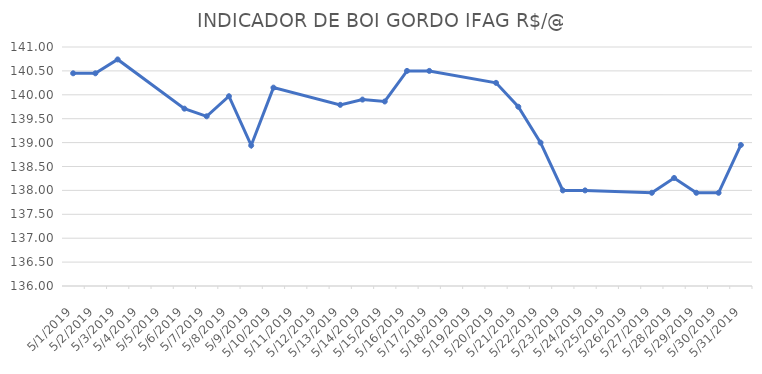
| Category | INDICADOR DE BOI GORDO IFAG |
|---|---|
| 5/1/19 | 140.45 |
| 5/2/19 | 140.45 |
| 5/3/19 | 140.74 |
| 5/6/19 | 139.71 |
| 5/7/19 | 139.55 |
| 5/8/19 | 139.97 |
| 5/9/19 | 138.94 |
| 5/10/19 | 140.15 |
| 5/13/19 | 139.79 |
| 5/14/19 | 139.9 |
| 5/15/19 | 139.86 |
| 5/16/19 | 140.5 |
| 5/17/19 | 140.5 |
| 5/20/19 | 140.25 |
| 5/21/19 | 139.75 |
| 5/22/19 | 139 |
| 5/23/19 | 138 |
| 5/24/19 | 138 |
| 5/27/19 | 137.95 |
| 5/28/19 | 138.26 |
| 5/29/19 | 137.95 |
| 5/30/19 | 137.95 |
| 5/31/19 | 138.95 |